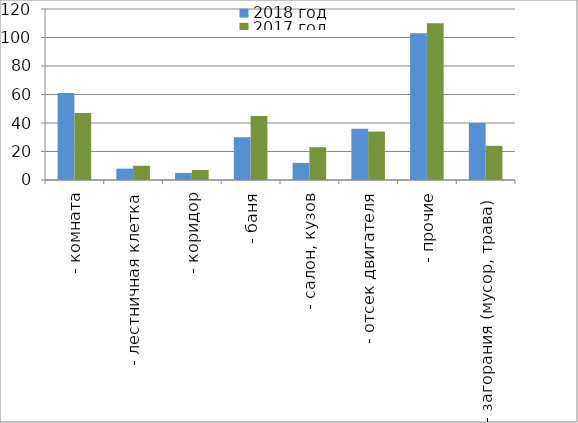
| Category | 2018 год | 2017 год |
|---|---|---|
|  - комната | 61 | 47 |
|  - лестничная клетка | 8 | 10 |
|  - коридор | 5 | 7 |
|  - баня | 30 | 45 |
|  - салон, кузов | 12 | 23 |
|  - отсек двигателя | 36 | 34 |
| - прочие | 103 | 110 |
| - загорания (мусор, трава)  | 40 | 24 |